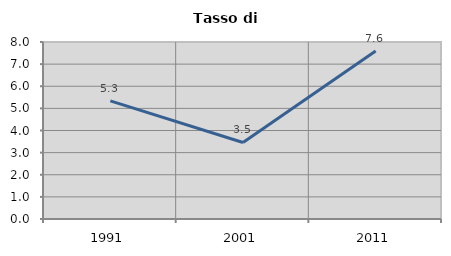
| Category | Tasso di disoccupazione   |
|---|---|
| 1991.0 | 5.338 |
| 2001.0 | 3.458 |
| 2011.0 | 7.597 |